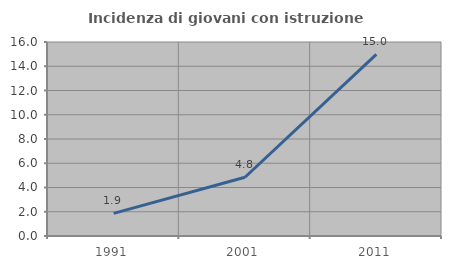
| Category | Incidenza di giovani con istruzione universitaria |
|---|---|
| 1991.0 | 1.863 |
| 2001.0 | 4.843 |
| 2011.0 | 14.985 |